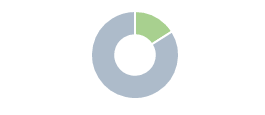
| Category | Series 0 |
|---|---|
| 0 | 0.16 |
| 1 | 0.84 |